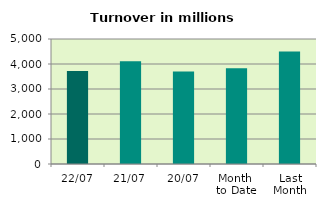
| Category | Series 0 |
|---|---|
| 22/07 | 3721.117 |
| 21/07 | 4105.898 |
| 20/07 | 3703.036 |
| Month 
to Date | 3826.808 |
| Last
Month | 4502.251 |